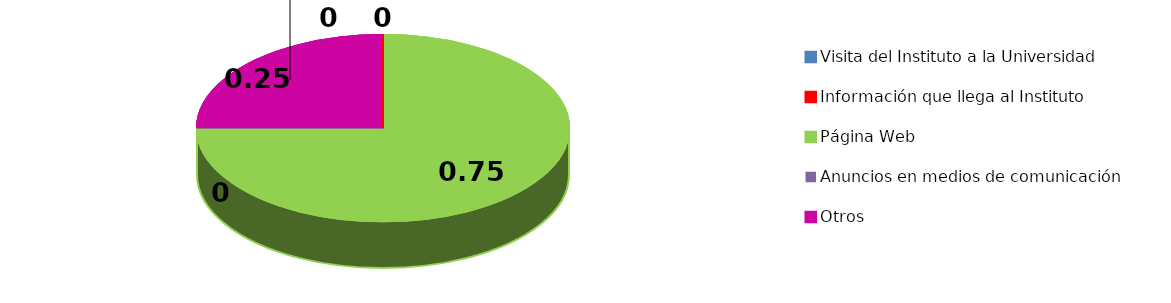
| Category | Series 0 |
|---|---|
| Visita del Instituto a la Universidad | 0 |
| Información que llega al Instituto | 0 |
| Página Web | 3 |
| Anuncios en medios de comunicación | 0 |
| Otros | 1 |